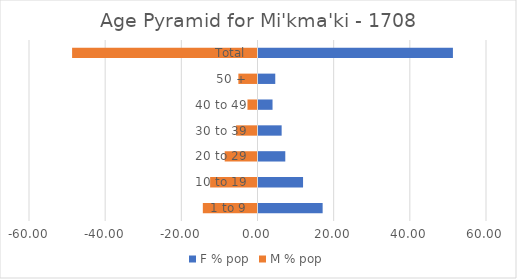
| Category | F % pop | M % pop |
|---|---|---|
| 1 to 9 | 17.105 | -14.354 |
| 10 to 19 | 11.962 | -12.44 |
| 20 to 29 | 7.297 | -8.612 |
| 30 to 39 | 6.34 | -5.622 |
| 40 to 49 | 3.947 | -2.632 |
| 50 + | 4.665 | -5.024 |
| Total | 51.316 | -48.684 |